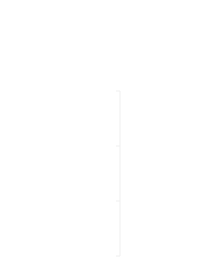
| Category | Pozitivno | Negativno |
|---|---|---|
| 0 | 0 | 0 |
| 1 | 169 | 0 |
| 2 | 169 | -169 |